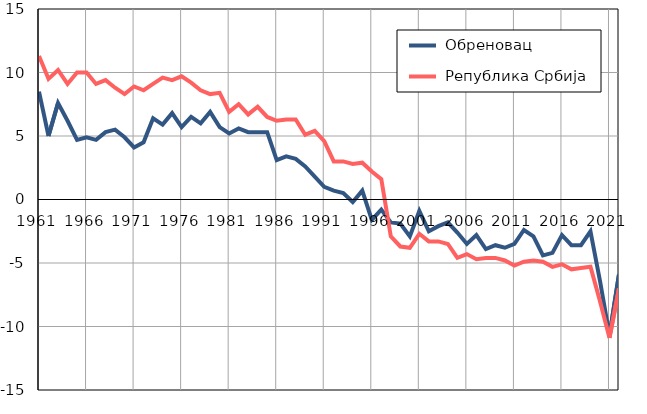
| Category |  Обреновац |  Република Србија |
|---|---|---|
| 1961.0 | 8.5 | 11.3 |
| 1962.0 | 5 | 9.5 |
| 1963.0 | 7.6 | 10.2 |
| 1964.0 | 6.2 | 9.1 |
| 1965.0 | 4.7 | 10 |
| 1966.0 | 4.9 | 10 |
| 1967.0 | 4.7 | 9.1 |
| 1968.0 | 5.3 | 9.4 |
| 1969.0 | 5.5 | 8.8 |
| 1970.0 | 4.9 | 8.3 |
| 1971.0 | 4.1 | 8.9 |
| 1972.0 | 4.5 | 8.6 |
| 1973.0 | 6.4 | 9.1 |
| 1974.0 | 5.9 | 9.6 |
| 1975.0 | 6.8 | 9.4 |
| 1976.0 | 5.7 | 9.7 |
| 1977.0 | 6.5 | 9.2 |
| 1978.0 | 6 | 8.6 |
| 1979.0 | 6.9 | 8.3 |
| 1980.0 | 5.7 | 8.4 |
| 1981.0 | 5.2 | 6.9 |
| 1982.0 | 5.6 | 7.5 |
| 1983.0 | 5.3 | 6.7 |
| 1984.0 | 5.3 | 7.3 |
| 1985.0 | 5.3 | 6.5 |
| 1986.0 | 3.1 | 6.2 |
| 1987.0 | 3.4 | 6.3 |
| 1988.0 | 3.2 | 6.3 |
| 1989.0 | 2.6 | 5.1 |
| 1990.0 | 1.8 | 5.4 |
| 1991.0 | 1 | 4.6 |
| 1992.0 | 0.7 | 3 |
| 1993.0 | 0.5 | 3 |
| 1994.0 | -0.2 | 2.8 |
| 1995.0 | 0.7 | 2.9 |
| 1996.0 | -1.6 | 2.2 |
| 1997.0 | -0.8 | 1.6 |
| 1998.0 | -1.8 | -2.9 |
| 1999.0 | -1.9 | -3.7 |
| 2000.0 | -2.9 | -3.8 |
| 2001.0 | -0.9 | -2.7 |
| 2002.0 | -2.5 | -3.3 |
| 2003.0 | -2.1 | -3.3 |
| 2004.0 | -1.8 | -3.5 |
| 2005.0 | -2.6 | -4.6 |
| 2006.0 | -3.5 | -4.3 |
| 2007.0 | -2.8 | -4.7 |
| 2008.0 | -3.9 | -4.6 |
| 2009.0 | -3.6 | -4.6 |
| 2010.0 | -3.8 | -4.8 |
| 2011.0 | -3.5 | -5.2 |
| 2012.0 | -2.4 | -4.9 |
| 2013.0 | -2.9 | -4.8 |
| 2014.0 | -4.4 | -4.9 |
| 2015.0 | -4.2 | -5.3 |
| 2016.0 | -2.8 | -5.1 |
| 2017.0 | -3.6 | -5.5 |
| 2018.0 | -3.6 | -5.4 |
| 2019.0 | -2.5 | -5.3 |
| 2020.0 | -6.4 | -8 |
| 2021.0 | -10.7 | -10.9 |
| 2022.0 | -5.9 | -7 |